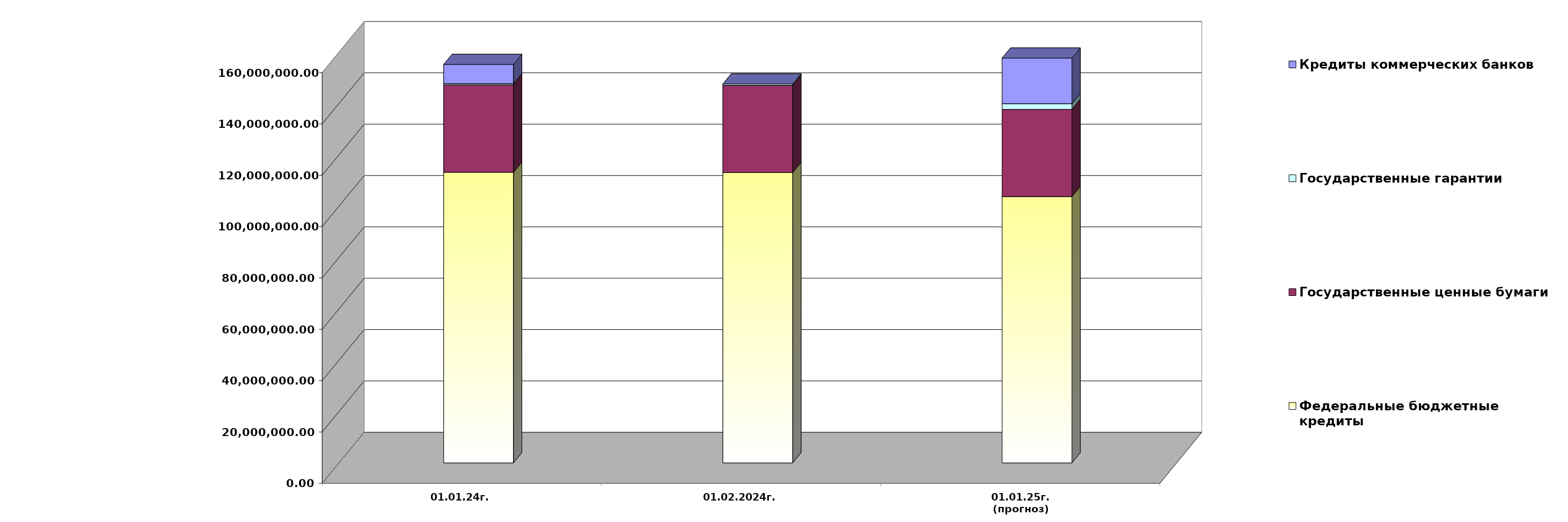
| Category | Федеральные бюджетные кредиты | Государственные ценные бумаги  | Государственные гарантии | Кредиты коммерческих банков |
|---|---|---|---|---|
| 01.01.24г. | 113223150.103 | 34000000 | 492844.914 | 7500000 |
| 01.02.2024г. | 113101358.397 | 34000000 | 490073.841 | 0 |
| 01.01.25г.
(прогноз) | 103727859.3 | 34000000 | 2193508.4 | 17760298.9 |